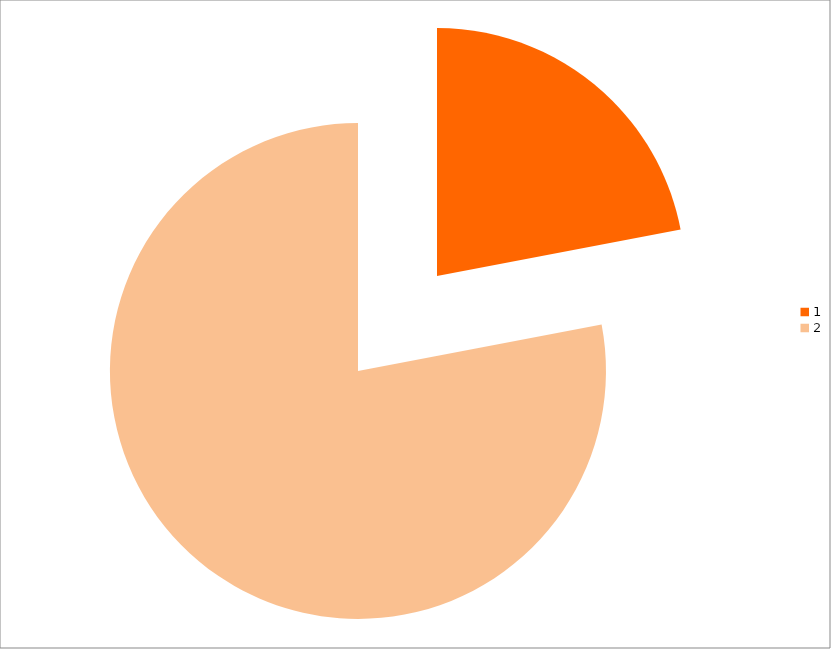
| Category | Series 0 |
|---|---|
| 0 | 22 |
| 1 | 78 |